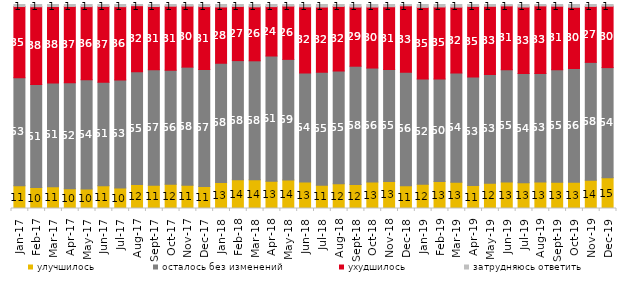
| Category | улучшилось | осталось без изменений | ухудшилось | затрудняюсь ответить |
|---|---|---|---|---|
| 2017-01-01 | 11.15 | 53 | 34.85 | 1 |
| 2017-02-01 | 10.25 | 50.5 | 38.15 | 1.1 |
| 2017-03-01 | 10.7 | 50.75 | 37.5 | 1 |
| 2017-04-01 | 9.7 | 51.95 | 37.4 | 0.95 |
| 2017-05-01 | 9.5 | 53.65 | 35.8 | 1.05 |
| 2017-06-01 | 11.2 | 50.7 | 37.15 | 0.95 |
| 2017-07-01 | 10.05 | 52.95 | 35.95 | 1.05 |
| 2017-08-01 | 11.8 | 55.2 | 32.4 | 0.6 |
| 2017-09-01 | 11.35 | 56.7 | 30.95 | 1 |
| 2017-10-01 | 11.9 | 55.9 | 31.35 | 0.85 |
| 2017-11-01 | 11.45 | 57.85 | 29.9 | 0.8 |
| 2017-12-01 | 10.8 | 57.35 | 30.8 | 1.05 |
| 2018-01-01 | 12.75 | 58.45 | 27.6 | 1.2 |
| 2018-02-01 | 14.1 | 58.4 | 26.55 | 0.95 |
| 2018-03-01 | 14.1 | 58.3 | 26.45 | 1.15 |
| 2018-04-01 | 13.35 | 61.4 | 24.2 | 1.05 |
| 2018-05-01 | 14 | 59.1 | 26.1 | 0.8 |
| 2018-06-01 | 12.95 | 53.5 | 32.4 | 1.15 |
| 2018-07-01 | 11.45 | 55.3 | 32 | 1.25 |
| 2018-08-01 | 12.1 | 55.25 | 31.7 | 0.95 |
| 2018-09-01 | 11.75 | 58 | 29 | 1.25 |
| 2018-10-01 | 12.95 | 55.9 | 29.9 | 1.25 |
| 2018-11-01 | 13.273 | 54.84 | 30.788 | 1.098 |
| 2018-12-01 | 11.2 | 55.6 | 32.55 | 0.65 |
| 2019-01-01 | 11.85 | 51.6 | 35.15 | 1.4 |
| 2019-02-01 | 13.2 | 50.3 | 35.3 | 1.2 |
| 2019-03-01 | 12.929 | 53.506 | 32.273 | 1.293 |
| 2019-04-01 | 11.238 | 53.168 | 34.653 | 0.941 |
| 2019-05-01 | 12.432 | 53.244 | 33.432 | 0.892 |
| 2019-06-01 | 13.017 | 54.963 | 31.322 | 0.698 |
| 2019-07-01 | 12.624 | 53.564 | 32.574 | 1.238 |
| 2019-08-01 | 12.937 | 53.197 | 33.167 | 0.699 |
| 2019-09-01 | 12.871 | 55.149 | 31.139 | 0.842 |
| 2019-10-01 | 12.921 | 55.693 | 30.05 | 1.337 |
| 2019-11-01 | 13.861 | 57.772 | 27.426 | 0.941 |
| 2019-12-01 | 15.099 | 53.96 | 30.099 | 0.842 |